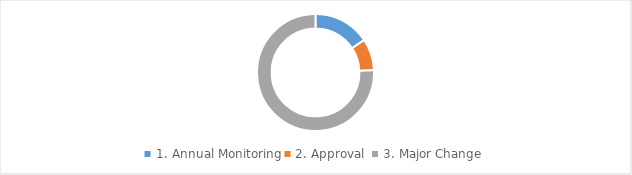
| Category | 2017-18 |
|---|---|
| 1. Annual Monitoring | 0.157 |
| 2. Approval  | 0.087 |
| 3. Major Change | 0.756 |